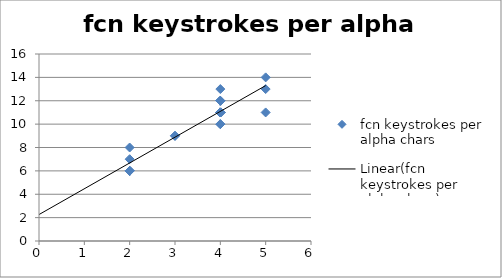
| Category | fcn keystrokes per alpha chars |
|---|---|
| 3.0 | 9 |
| 4.0 | 11 |
| 4.0 | 12 |
| 4.0 | 12 |
| 3.0 | 9 |
| 5.0 | 13 |
| 4.0 | 11 |
| 4.0 | 10 |
| 4.0 | 10 |
| 2.0 | 6 |
| 2.0 | 6 |
| 2.0 | 6 |
| 2.0 | 6 |
| 5.0 | 11 |
| 4.0 | 12 |
| 2.0 | 7 |
| 4.0 | 11 |
| 5.0 | 14 |
| 4.0 | 11 |
| 4.0 | 11 |
| 4.0 | 13 |
| 2.0 | 8 |
| 4.0 | 11 |
| 4.0 | 12 |
| 4.0 | 11 |